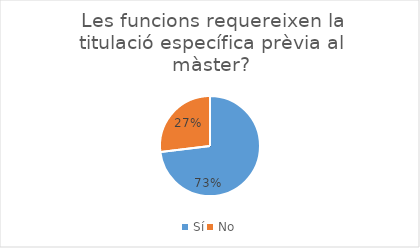
| Category | Series 0 |
|---|---|
| Sí | 76 |
| No | 28 |